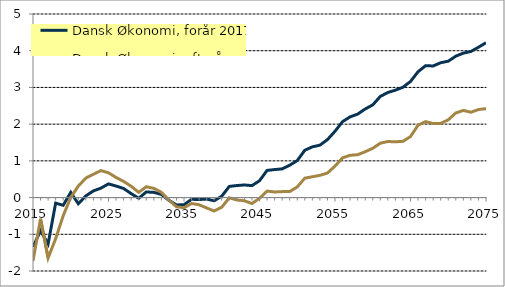
| Category | Dansk Økonomi, forår 2017 | Dansk Økonomi, efterår 2016 |
|---|---|---|
| 2015-01-01 | -1.343 | -1.727 |
| 2016-01-01 | -0.903 | -0.577 |
| 2017-01-01 | -1.263 | -1.646 |
| 2018-01-01 | -0.152 | -1.12 |
| 2019-01-01 | -0.21 | -0.494 |
| 2020-01-01 | 0.142 | 0.004 |
| 2021-01-01 | -0.169 | 0.314 |
| 2022-01-01 | 0.046 | 0.531 |
| 2023-01-01 | 0.182 | 0.637 |
| 2024-01-01 | 0.257 | 0.735 |
| 2025-01-01 | 0.372 | 0.675 |
| 2026-01-01 | 0.314 | 0.548 |
| 2027-01-01 | 0.248 | 0.441 |
| 2028-01-01 | 0.108 | 0.309 |
| 2029-01-01 | -0.018 | 0.142 |
| 2030-01-01 | 0.153 | 0.294 |
| 2031-01-01 | 0.142 | 0.252 |
| 2032-01-01 | 0.087 | 0.143 |
| 2033-01-01 | -0.074 | -0.068 |
| 2034-01-01 | -0.201 | -0.249 |
| 2035-01-01 | -0.194 | -0.279 |
| 2036-01-01 | -0.047 | -0.162 |
| 2037-01-01 | -0.053 | -0.196 |
| 2038-01-01 | -0.041 | -0.283 |
| 2039-01-01 | -0.087 | -0.366 |
| 2040-01-01 | 0.039 | -0.263 |
| 2041-01-01 | 0.304 | -0.006 |
| 2042-01-01 | 0.328 | -0.065 |
| 2043-01-01 | 0.343 | -0.087 |
| 2044-01-01 | 0.326 | -0.163 |
| 2045-01-01 | 0.459 | -0.02 |
| 2046-01-01 | 0.74 | 0.176 |
| 2047-01-01 | 0.763 | 0.153 |
| 2048-01-01 | 0.781 | 0.162 |
| 2049-01-01 | 0.881 | 0.164 |
| 2050-01-01 | 1.008 | 0.29 |
| 2051-01-01 | 1.288 | 0.529 |
| 2052-01-01 | 1.382 | 0.567 |
| 2053-01-01 | 1.427 | 0.605 |
| 2054-01-01 | 1.578 | 0.668 |
| 2055-01-01 | 1.806 | 0.857 |
| 2056-01-01 | 2.068 | 1.081 |
| 2057-01-01 | 2.198 | 1.152 |
| 2058-01-01 | 2.273 | 1.167 |
| 2059-01-01 | 2.412 | 1.249 |
| 2060-01-01 | 2.524 | 1.343 |
| 2061-01-01 | 2.754 | 1.481 |
| 2062-01-01 | 2.863 | 1.527 |
| 2063-01-01 | 2.925 | 1.519 |
| 2064-01-01 | 3.005 | 1.532 |
| 2065-01-01 | 3.162 | 1.662 |
| 2066-01-01 | 3.427 | 1.972 |
| 2067-01-01 | 3.591 | 2.068 |
| 2068-01-01 | 3.585 | 2.016 |
| 2069-01-01 | 3.673 | 2.021 |
| 2070-01-01 | 3.714 | 2.118 |
| 2071-01-01 | 3.852 | 2.306 |
| 2072-01-01 | 3.934 | 2.374 |
| 2073-01-01 | 3.979 | 2.324 |
| 2074-01-01 | 4.094 | 2.397 |
| 2075-01-01 | 4.217 | 2.423 |